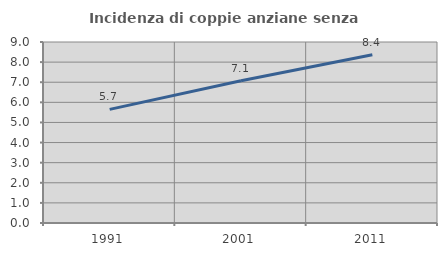
| Category | Incidenza di coppie anziane senza figli  |
|---|---|
| 1991.0 | 5.651 |
| 2001.0 | 7.072 |
| 2011.0 | 8.369 |